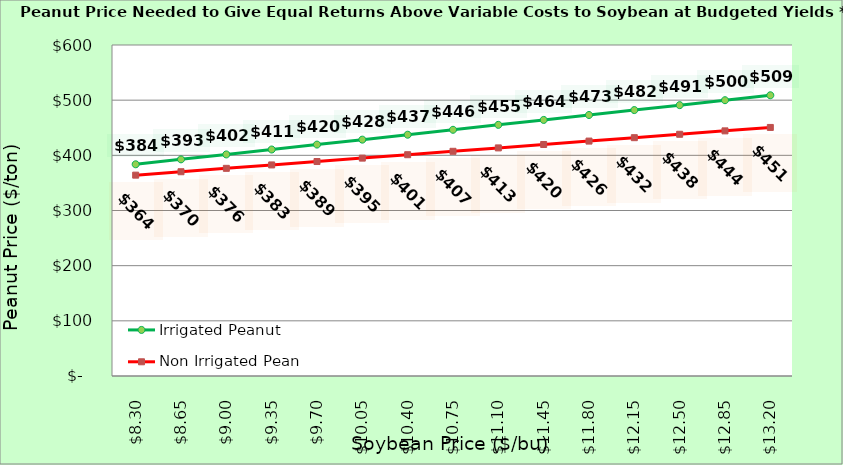
| Category | Irrigated Peanut | Non Irrigated Peanut |
|---|---|---|
| 8.300000000000002 | 383.759 | 364.069 |
| 8.650000000000002 | 392.695 | 370.246 |
| 9.000000000000002 | 401.631 | 376.422 |
| 9.350000000000001 | 410.567 | 382.599 |
| 9.700000000000001 | 419.503 | 388.775 |
| 10.05 | 428.439 | 394.952 |
| 10.4 | 437.376 | 401.128 |
| 10.75 | 446.312 | 407.305 |
| 11.1 | 455.248 | 413.481 |
| 11.45 | 464.184 | 419.657 |
| 11.799999999999999 | 473.12 | 425.834 |
| 12.149999999999999 | 482.056 | 432.01 |
| 12.499999999999998 | 490.993 | 438.187 |
| 12.849999999999998 | 499.929 | 444.363 |
| 13.199999999999998 | 508.865 | 450.54 |